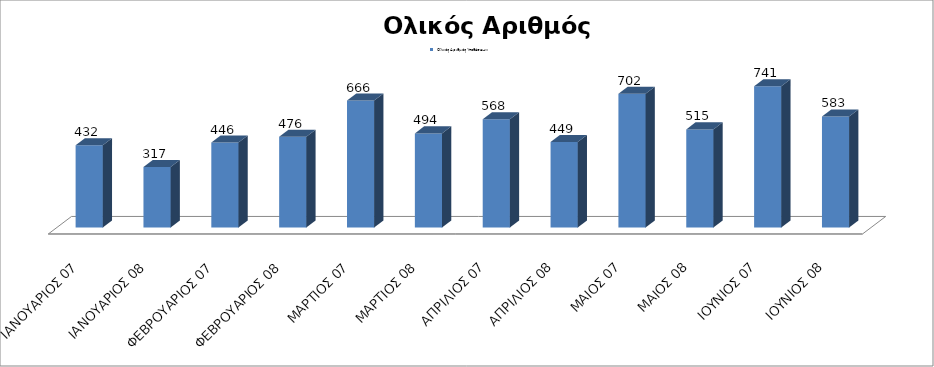
| Category | Ολικός Αριθμός Υποθέσεων: |
|---|---|
| ΙΑΝΟΥΑΡΙΟΣ 07 | 432 |
| ΙΑΝΟΥΑΡΙΟΣ 08 | 317 |
| ΦΕΒΡΟΥΑΡΙΟΣ 07 | 446 |
| ΦΕΒΡΟΥΑΡΙΟΣ 08 | 476 |
| ΜΑΡΤΙΟΣ 07 | 666 |
| ΜΑΡΤΙΟΣ 08 | 494 |
| ΑΠΡΙΛΙΟΣ 07 | 568 |
| ΑΠΡΙΛΙΟΣ 08 | 449 |
| ΜΑΙΟΣ 07 | 702 |
| ΜΑΙΟΣ 08 | 515 |
| ΙΟΥΝΙΟΣ 07 | 741 |
| ΙΟΥΝΙΟΣ 08 | 583 |